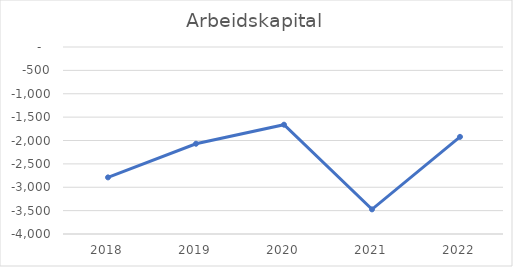
| Category | Series 0 |
|---|---|
| 2018.0 | -2789 |
| 2019.0 | -2069 |
| 2020.0 | -1662 |
| 2021.0 | -3473 |
| 2022.0 | -1922 |